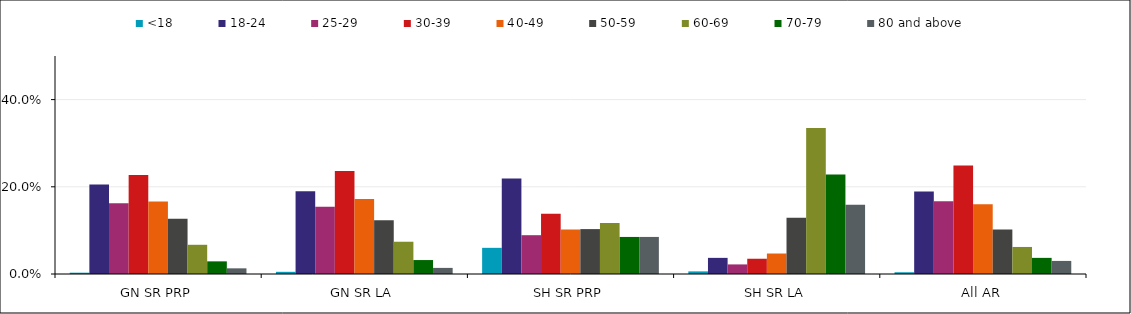
| Category | <18 | 18-24 | 25-29 | 30-39 | 40-49 | 50-59 | 60-69 | 70-79 | 80 and above |
|---|---|---|---|---|---|---|---|---|---|
| GN SR PRP | 0.003 | 0.205 | 0.162 | 0.227 | 0.166 | 0.127 | 0.067 | 0.029 | 0.013 |
| GN SR LA | 0.005 | 0.19 | 0.154 | 0.236 | 0.172 | 0.123 | 0.074 | 0.032 | 0.014 |
| SH SR PRP | 0.06 | 0.219 | 0.089 | 0.138 | 0.102 | 0.103 | 0.117 | 0.085 | 0.085 |
| SH SR LA | 0.006 | 0.037 | 0.022 | 0.035 | 0.047 | 0.129 | 0.335 | 0.228 | 0.159 |
| All AR | 0.004 | 0.189 | 0.167 | 0.249 | 0.16 | 0.102 | 0.062 | 0.037 | 0.03 |